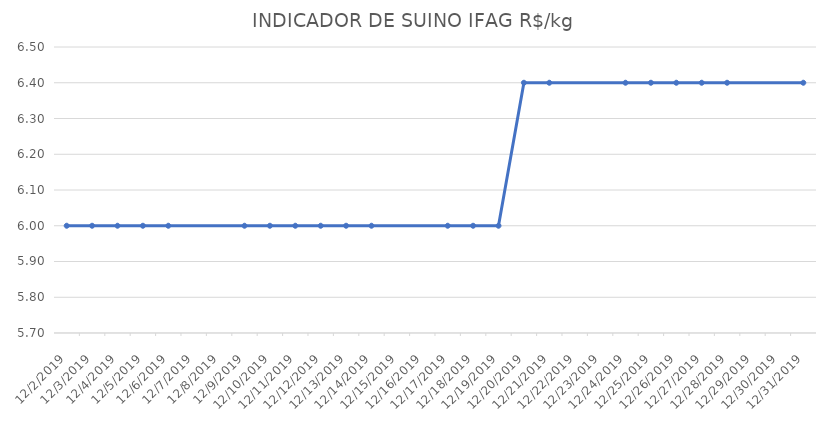
| Category | INDICADOR DE SUINO IFAG |
|---|---|
| 12/2/19 | 6 |
| 12/3/19 | 6 |
| 12/4/19 | 6 |
| 12/5/19 | 6 |
| 12/6/19 | 6 |
| 12/9/19 | 6 |
| 12/10/19 | 6 |
| 12/11/19 | 6 |
| 12/12/19 | 6 |
| 12/13/19 | 6 |
| 12/14/19 | 6 |
| 12/17/19 | 6 |
| 12/18/19 | 6 |
| 12/19/19 | 6 |
| 12/20/19 | 6.4 |
| 12/21/19 | 6.4 |
| 12/24/19 | 6.4 |
| 12/25/19 | 6.4 |
| 12/26/19 | 6.4 |
| 12/27/19 | 6.4 |
| 12/28/19 | 6.4 |
| 12/31/19 | 6.4 |